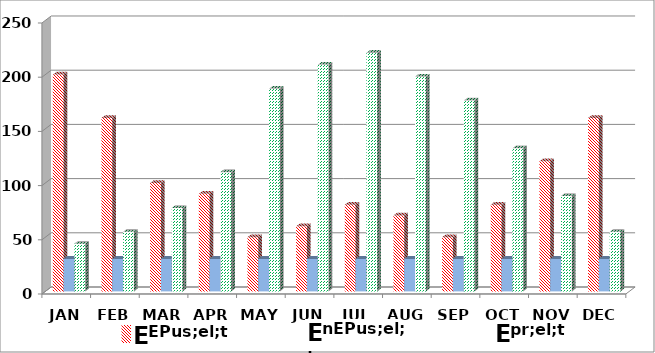
| Category |                 |
|---|---|
| JAN | 44 |
| FEB | 55 |
| MAR | 77 |
| APR | 110 |
| MAY | 187 |
| JUN | 209 |
| JUL | 220 |
| AUG | 198 |
| SEP | 176 |
| OCT | 132 |
| NOV | 88 |
| DEC | 55 |